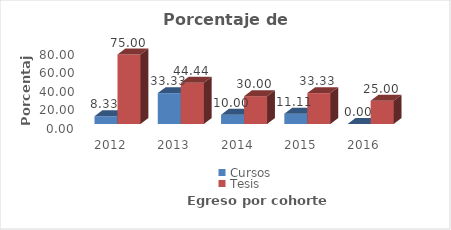
| Category | Cursos | Tesis |
|---|---|---|
| 2012.0 | 8.333 | 75 |
| 2013.0 | 33.333 | 44.444 |
| 2014.0 | 10 | 30 |
| 2015.0 | 11.111 | 33.333 |
| 2016.0 | 0 | 25 |